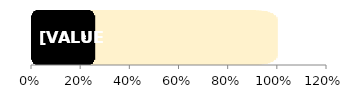
| Category | Men | Female |
|---|---|---|
| 0 | 1 | 0.257 |